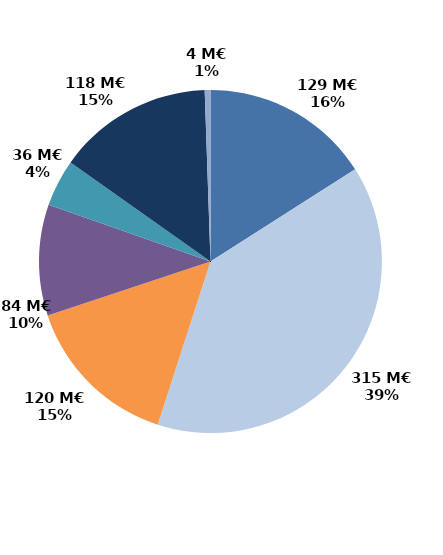
| Category | Series 0 |
|---|---|
| Accueil et information (CEP 1) | 128.921 |
| Accompagnement renforcé (CEP 2 et 3) | 314.806 |
| Suivi | 120.439 |
| Missions locales | 84.377 |
| CSP | 35.888 |
| Aide à la création d'entreprise | 118.262 |
| Aide à l'insertion | 4.365 |